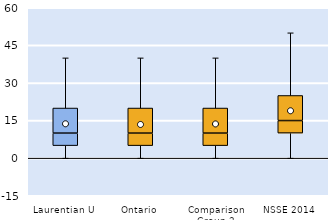
| Category | 25th | 50th | 75th |
|---|---|---|---|
| Laurentian U | 5 | 5 | 10 |
| Ontario | 5 | 5 | 10 |
| Comparison Group 2 | 5 | 5 | 10 |
| NSSE 2014 | 10 | 5 | 10 |